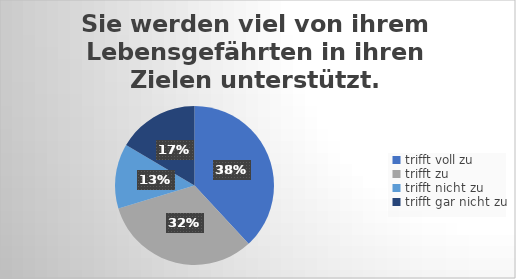
| Category | Sie werden viel von ihrem Lebensgefährten in ihren Zielen unterstützt. |
|---|---|
| trifft voll zu | 104 |
| trifft zu  | 88 |
| trifft nicht zu  | 36 |
| trifft gar nicht zu | 45 |